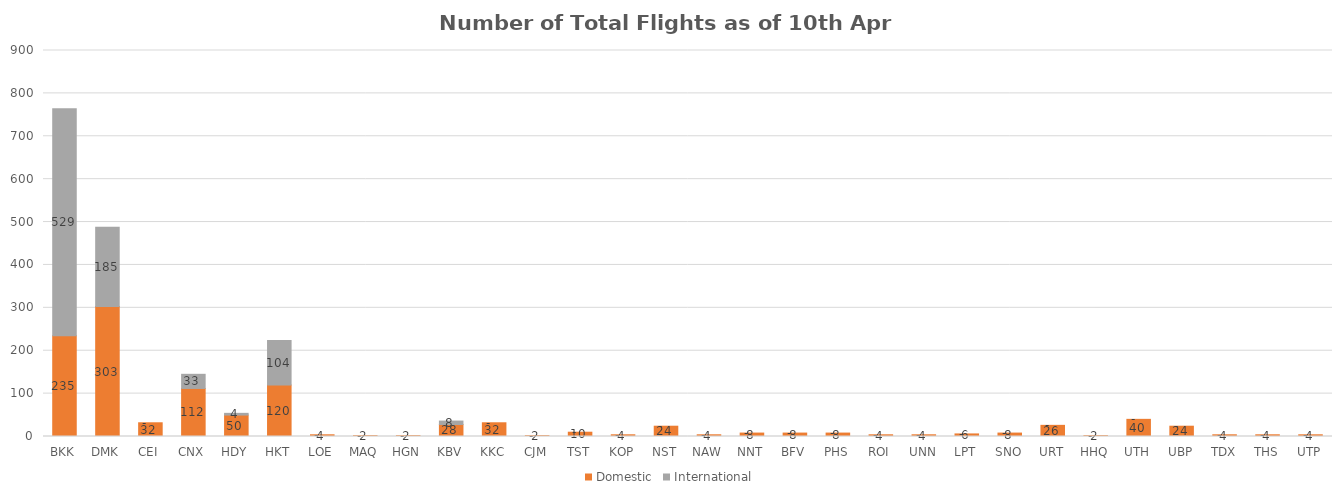
| Category | Domestic | International |
|---|---|---|
| BKK | 235 | 529 |
| DMK | 303 | 185 |
| CEI | 32 | 0 |
| CNX | 112 | 33 |
| HDY | 50 | 4 |
| HKT | 120 | 104 |
| LOE | 4 | 0 |
| MAQ | 2 | 0 |
| HGN | 2 | 0 |
| KBV | 28 | 8 |
| KKC | 32 | 0 |
| CJM | 2 | 0 |
| TST | 10 | 0 |
| KOP | 4 | 0 |
| NST | 24 | 0 |
| NAW | 4 | 0 |
| NNT | 8 | 0 |
| BFV | 8 | 0 |
| PHS | 8 | 0 |
| ROI | 4 | 0 |
| UNN | 4 | 0 |
| LPT | 6 | 0 |
| SNO | 8 | 0 |
| URT | 26 | 0 |
| HHQ | 2 | 0 |
| UTH | 40 | 0 |
| UBP | 24 | 0 |
| TDX | 4 | 0 |
| THS | 4 | 0 |
| UTP | 4 | 0 |